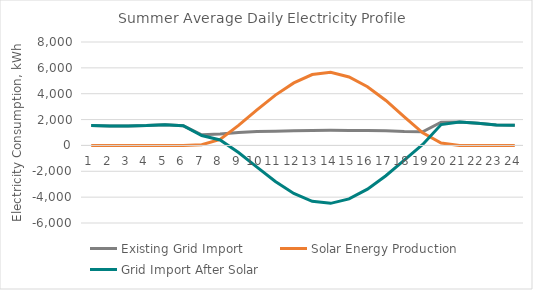
| Category | Existing Grid Import | Solar Energy Production  | Grid Import After Solar |
|---|---|---|---|
| 0 | 1533.927 | 0 | 1533.927 |
| 1 | 1501.754 | 0 | 1501.754 |
| 2 | 1499.129 | 0 | 1499.129 |
| 3 | 1532.876 | 0 | 1532.876 |
| 4 | 1604.181 | 0 | 1604.181 |
| 5 | 1519.068 | 0 | 1519.068 |
| 6 | 823.128 | 59.158 | 763.97 |
| 7 | 881.007 | 460.118 | 420.888 |
| 8 | 1000.188 | 1551.256 | -551.068 |
| 9 | 1069.978 | 2747.564 | -1677.586 |
| 10 | 1098.605 | 3891.287 | -2792.682 |
| 11 | 1128.247 | 4837.816 | -3709.569 |
| 12 | 1158.155 | 5481.982 | -4323.827 |
| 13 | 1172.438 | 5652.883 | -4480.446 |
| 14 | 1159.07 | 5297.935 | -4138.865 |
| 15 | 1159.976 | 4542.026 | -3382.05 |
| 16 | 1135.242 | 3477.18 | -2341.939 |
| 17 | 1068.596 | 2208.568 | -1139.973 |
| 18 | 1050.779 | 979.395 | 71.384 |
| 19 | 1797.61 | 184.047 | 1613.562 |
| 20 | 1810.338 | 0 | 1810.338 |
| 21 | 1706.19 | 0 | 1706.19 |
| 22 | 1589.103 | 0 | 1589.103 |
| 23 | 1561.596 | 0 | 1561.596 |